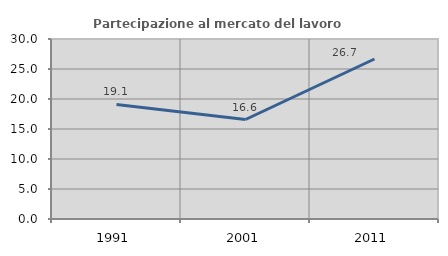
| Category | Partecipazione al mercato del lavoro  femminile |
|---|---|
| 1991.0 | 19.084 |
| 2001.0 | 16.583 |
| 2011.0 | 26.667 |